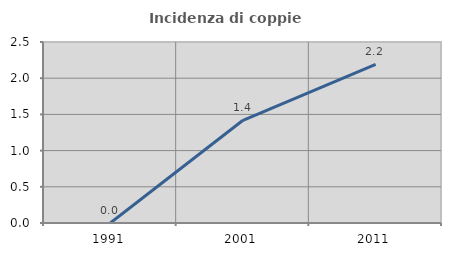
| Category | Incidenza di coppie miste |
|---|---|
| 1991.0 | 0 |
| 2001.0 | 1.418 |
| 2011.0 | 2.19 |